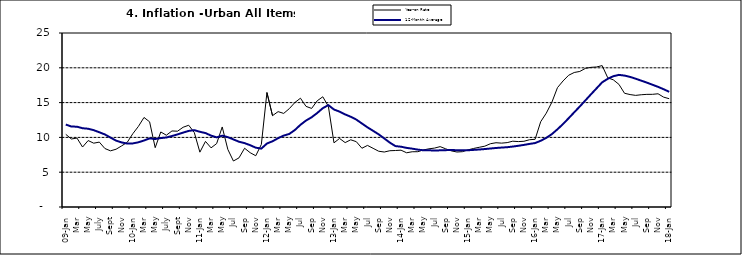
| Category | Year-on Rate | 12-Month Average |
|---|---|---|
| 09-Jan | 10.439 | 11.844 |
| Feb | 9.772 | 11.562 |
| Mar | 9.907 | 11.538 |
| Apr | 8.618 | 11.319 |
| May | 9.547 | 11.246 |
| June | 9.17 | 11.039 |
| July | 9.325 | 10.738 |
| Aug | 8.401 | 10.424 |
| Sept | 8.07 | 9.973 |
| Oct | 8.3 | 9.535 |
| Nov | 8.781 | 9.278 |
| Dec | 9.298 | 9.117 |
| 10-Jan | 10.534 | 9.136 |
| Feb | 11.584 | 9.297 |
| Mar | 12.864 | 9.555 |
| Apr | 12.24 | 9.859 |
| May | 8.524 | 9.769 |
| June | 10.781 | 9.904 |
| July | 10.313 | 9.987 |
| Aug | 10.924 | 10.197 |
| Sept | 10.891 | 10.43 |
| Oct | 11.457 | 10.689 |
| Nov | 11.748 | 10.932 |
| Dec | 10.699 | 11.042 |
| 11-Jan | 7.878 | 10.806 |
| Feb | 9.426 | 10.623 |
| Mar | 8.498 | 10.26 |
| Apr | 9.11 | 10.005 |
| May | 11.5 | 10.249 |
| Jun | 8.278 | 10.034 |
| Jul | 6.608 | 9.711 |
| Aug | 7.061 | 9.38 |
| Sep | 8.443 | 9.178 |
| Oct | 7.802 | 8.88 |
| Nov | 7.365 | 8.525 |
| Dec | 8.993 | 8.395 |
| 12-Jan | 16.445 | 9.119 |
| Feb | 13.123 | 9.443 |
| Mar | 13.701 | 9.889 |
| Apr | 13.447 | 10.259 |
| May | 14.127 | 10.496 |
| Jun | 15.012 | 11.062 |
| Jul | 15.63 | 11.81 |
| Aug | 14.456 | 12.422 |
| Sep | 14.162 | 12.893 |
| Oct | 15.26 | 13.506 |
| Nov | 15.836 | 14.199 |
| Dec | 14.459 | 14.637 |
| 13-Jan | 9.22 | 14.006 |
| Feb | 9.85 | 13.703 |
| Mar | 9.253 | 13.302 |
| Apr | 9.657 | 12.966 |
| May | 9.385 | 12.557 |
| Jun | 8.441 | 11.999 |
| Jul | 8.849 | 11.443 |
| Aug | 8.431 | 10.946 |
| Sep | 8.013 | 10.44 |
| Oct | 7.9 | 9.849 |
| Nov | 8.086 | 9.245 |
| Dec | 8.117 | 8.75 |
| 14-Jan | 8.164 | 8.662 |
| Feb | 7.791 | 8.493 |
| Mar | 7.937 | 8.384 |
| Apr | 7.947 | 8.246 |
| May | 8.195 | 8.151 |
| Jun | 8.358 | 8.146 |
| Jul | 8.464 | 8.118 |
| Aug | 8.673 | 8.141 |
| Sep | 8.357 | 8.17 |
| Oct | 8.064 | 8.182 |
| Nov | 7.902 | 8.165 |
| Dec | 7.948 | 8.151 |
| 15-Jan | 8.211 | 8.155 |
| Feb | 8.412 | 8.206 |
| Mar | 8.579 | 8.26 |
| Apr | 8.742 | 8.326 |
| May | 9.092 | 8.403 |
| Jun | 9.232 | 8.478 |
| Jul | 9.177 | 8.54 |
| Aug | 9.25 | 8.591 |
| Sep | 9.455 | 8.684 |
| Oct | 9.398 | 8.795 |
| Nov | 9.442 | 8.922 |
| Dec | 9.665 | 9.064 |
| 16-Jan | 9.728 | 9.19 |
| Feb | 12.254 | 9.516 |
| Mar | 13.485 | 9.935 |
| Apr | 15.052 | 10.474 |
| May | 17.148 | 11.165 |
| Jun | 18.111 | 11.925 |
| Jul | 18.927 | 12.754 |
| Aug | 19.325 | 13.605 |
| Sep | 19.476 | 14.444 |
| Oct | 19.914 | 15.318 |
| Nov | 20.067 | 16.193 |
| Dec | 20.118 | 17.05 |
| 17-Jan | 20.315 | 17.914 |
| Feb | 18.569 | 18.418 |
| Mar | 18.27 | 18.794 |
| Apr | 17.621 | 18.982 |
| May | 16.343 | 18.883 |
| Jun | 16.153 | 18.692 |
| Jul | 16.038 | 18.43 |
| Aug | 16.128 | 18.151 |
| Sep | 16.183 | 17.872 |
| Oct | 16.187 | 17.567 |
| Nov | 16.267 | 17.264 |
| Dec | 15.785 | 16.921 |
| 18-Jan | 15.559 | 16.55 |